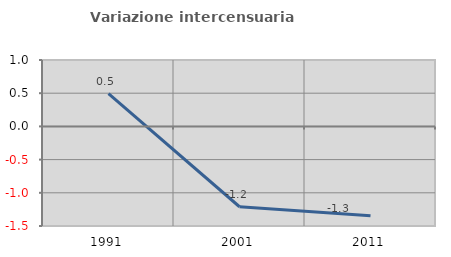
| Category | Variazione intercensuaria annua |
|---|---|
| 1991.0 | 0.494 |
| 2001.0 | -1.21 |
| 2011.0 | -1.347 |